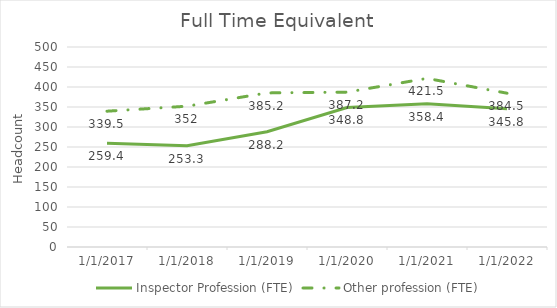
| Category | Inspector Profession (FTE) | Other profession (FTE) |
|---|---|---|
| 3/31/17 | 259.4 | 339.5 |
| 3/31/18 | 253.3 | 352 |
| 3/31/19 | 288.2 | 385.2 |
| 3/31/20 | 348.8 | 387.2 |
| 3/31/21 | 358.4 | 421.5 |
| 3/31/22 | 345.785 | 384.537 |